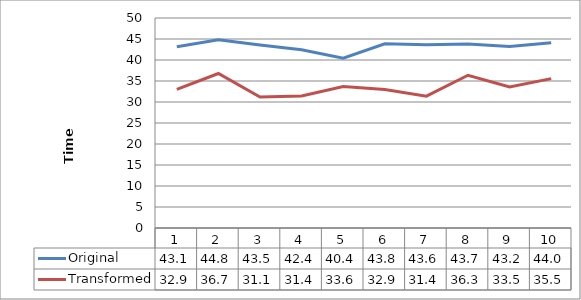
| Category | Original | Transformed |
|---|---|---|
| 0 | 43.17 | 32.99 |
| 1 | 44.8 | 36.78 |
| 2 | 43.59 | 31.19 |
| 3 | 42.43 | 31.43 |
| 4 | 40.45 | 33.68 |
| 5 | 43.84 | 32.95 |
| 6 | 43.64 | 31.4 |
| 7 | 43.78 | 36.37 |
| 8 | 43.2 | 33.57 |
| 9 | 44.09 | 35.56 |